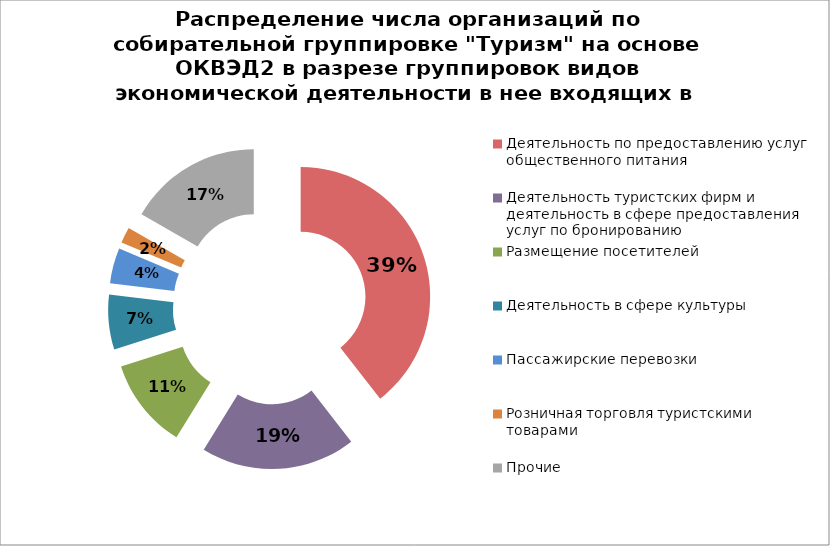
| Category | Series 0 |
|---|---|
| Деятельность по предоставлению услуг общественного питания | 39.486 |
| Деятельность туристских фирм и деятельность в сфере предоставления услуг по бронированию | 19.307 |
| Размещение посетителей | 11.27 |
| Деятельность в сфере культуры | 6.851 |
| Пассажирские перевозки | 4.406 |
| Розничная торговля туристскими товарами | 1.995 |
| Прочие | 16.684 |